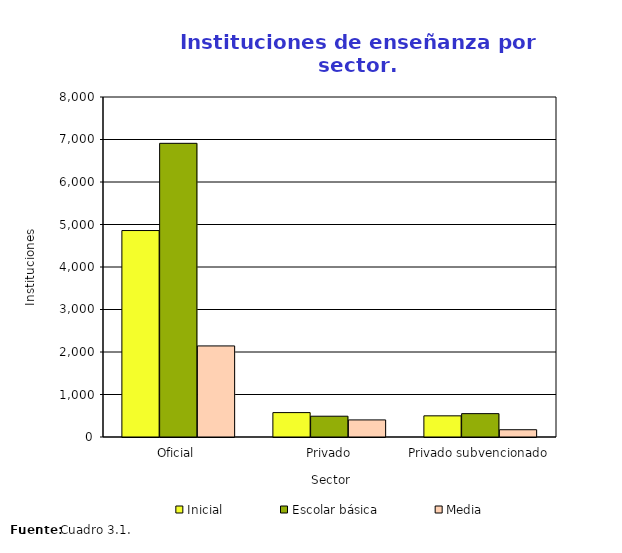
| Category | Inicial | Escolar básica | Media |
|---|---|---|---|
| Oficial | 4858 | 6910 | 2143 |
| Privado | 574 | 489 | 402 |
| Privado subvencionado | 498 | 550 | 171 |